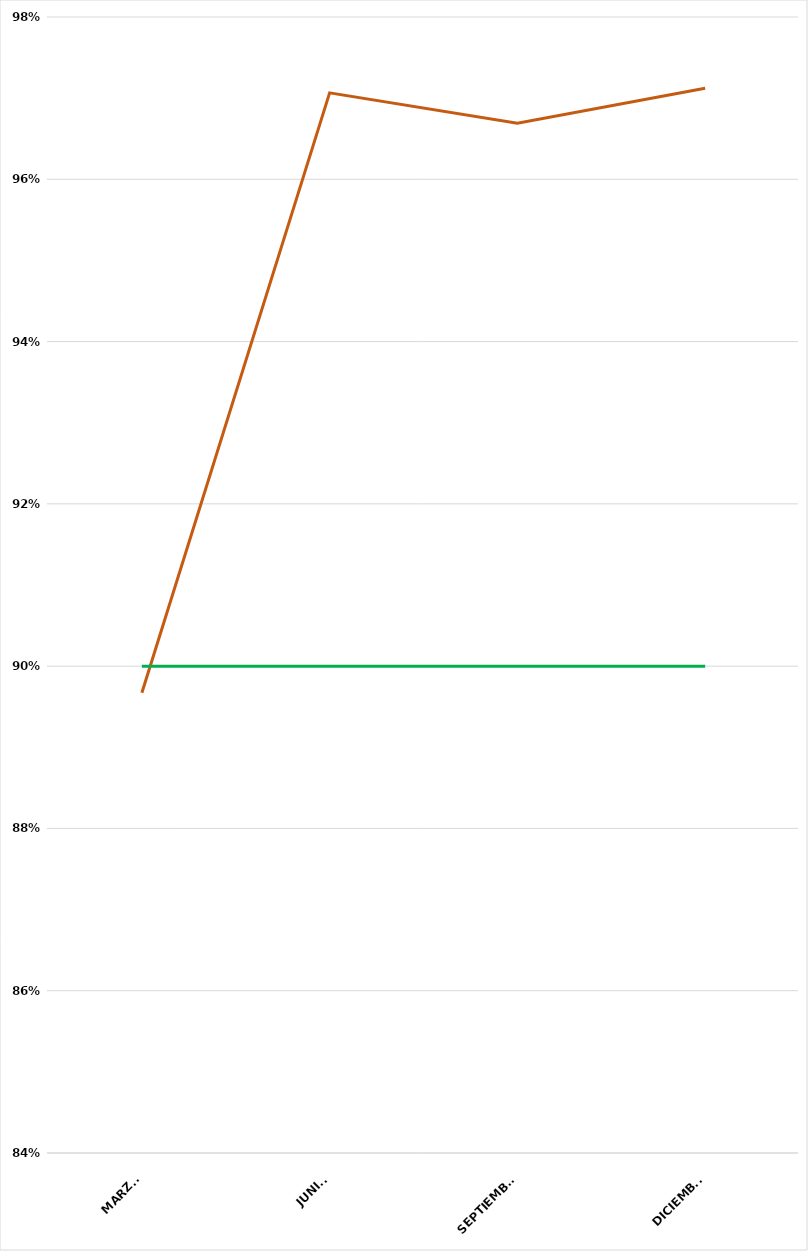
| Category | VALOR  | META PONDERADA |
|---|---|---|
| MARZO | 0.897 | 0.9 |
| JUNIO | 0.971 | 0.9 |
| SEPTIEMBRE | 0.967 | 0.9 |
| DICIEMBRE | 0.971 | 0.9 |